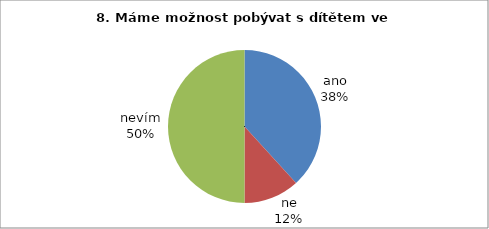
| Category | 8. |
|---|---|
| ano | 13 |
| ne | 4 |
| nevím | 17 |